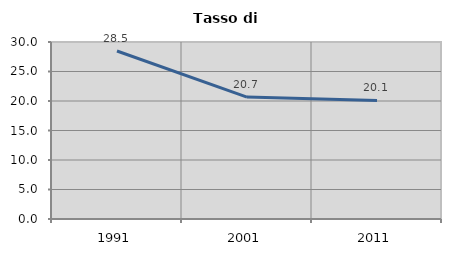
| Category | Tasso di disoccupazione   |
|---|---|
| 1991.0 | 28.479 |
| 2001.0 | 20.659 |
| 2011.0 | 20.097 |